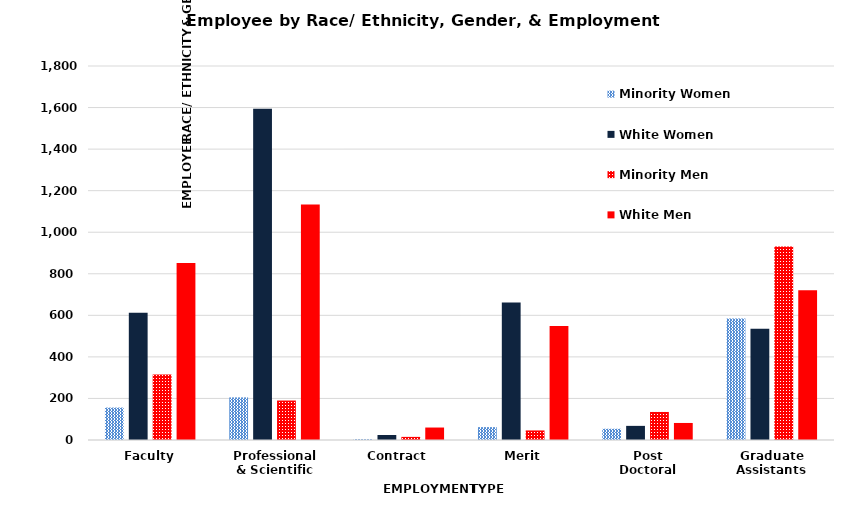
| Category | Minority Women | White Women | Minority Men | White Men |
|---|---|---|---|---|
| Faculty | 156 | 612 | 315 | 852 |
| Professional
& Scientific | 205 | 1594 | 190 | 1134 |
| Contract | 4 | 24 | 15 | 60 |
| Merit | 62 | 662 | 46 | 549 |
| Post Doctoral | 54 | 68 | 135 | 82 |
| Graduate
Assistants | 585 | 535 | 931 | 721 |